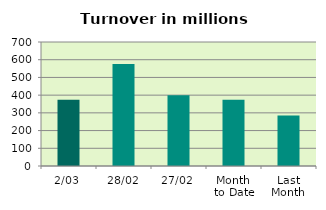
| Category | Series 0 |
|---|---|
| 2/03 | 373.638 |
| 28/02 | 575.213 |
| 27/02 | 398.715 |
| Month 
to Date | 373.638 |
| Last
Month | 285.08 |